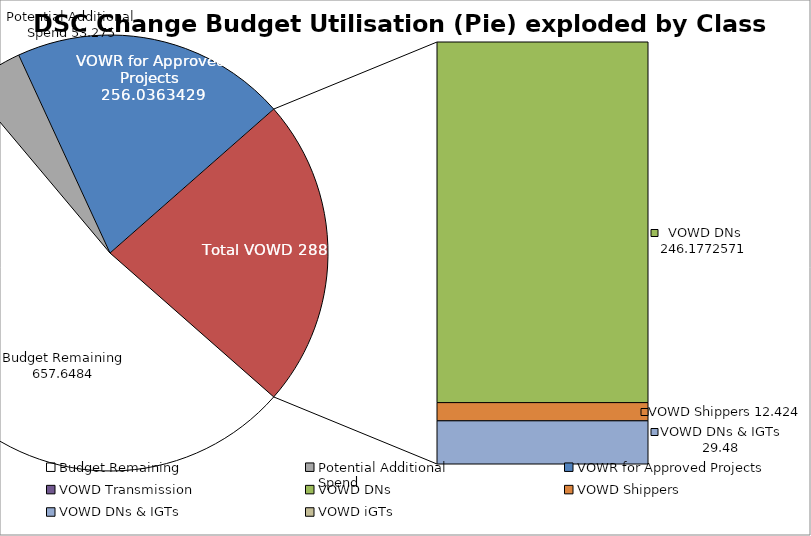
| Category | Series 0 |
|---|---|
| Budget Remaining | 657.648 |
| Potential Additional 
Spend | 53.275 |
| VOWR for Approved Projects | 256.036 |
| VOWD Transmission | 0 |
| VOWD DNs | 246.177 |
| VOWD Shippers | 12.424 |
| VOWD DNs & IGTs | 29.48 |
| VOWD iGTs | 0 |